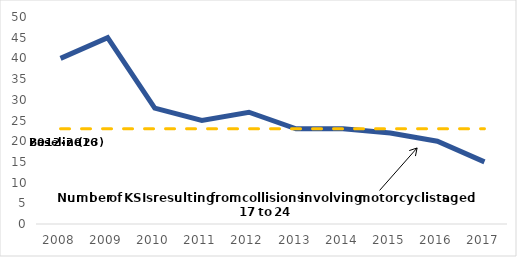
| Category | Series 0 | Series 1 |
|---|---|---|
| 2008.0 | 40 | 23 |
| 2009.0 | 45 | 23 |
| 2010.0 | 28 | 23 |
| 2011.0 | 25 | 23 |
| 2012.0 | 27 | 23 |
| 2013.0 | 23 | 23 |
| 2014.0 | 23 | 23 |
| 2015.0 | 22 | 23 |
| 2016.0 | 20 | 23 |
| 2017.0 | 15 | 23 |